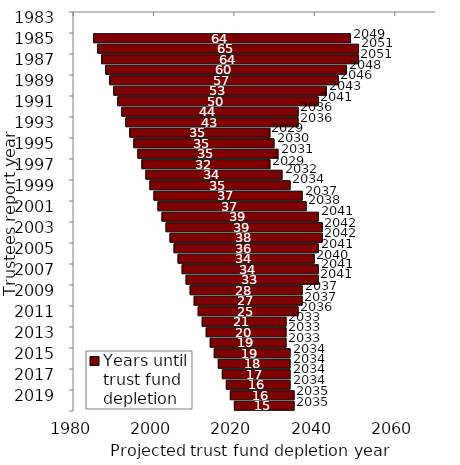
| Category | Series 1 | Years until trust fund depletion |
|---|---|---|
| 1983.0 | 1983 | 0 |
| 1984.0 | 1984 | 0 |
| 1985.0 | 1985 | 64 |
| 1986.0 | 1986 | 65 |
| 1987.0 | 1987 | 64 |
| 1988.0 | 1988 | 60 |
| 1989.0 | 1989 | 57 |
| 1990.0 | 1990 | 53 |
| 1991.0 | 1991 | 50 |
| 1992.0 | 1992 | 44 |
| 1993.0 | 1993 | 43 |
| 1994.0 | 1994 | 35 |
| 1995.0 | 1995 | 35 |
| 1996.0 | 1996 | 35 |
| 1997.0 | 1997 | 32 |
| 1998.0 | 1998 | 34 |
| 1999.0 | 1999 | 35 |
| 2000.0 | 2000 | 37 |
| 2001.0 | 2001 | 37 |
| 2002.0 | 2002 | 39 |
| 2003.0 | 2003 | 39 |
| 2004.0 | 2004 | 38 |
| 2005.0 | 2005 | 36 |
| 2006.0 | 2006 | 34 |
| 2007.0 | 2007 | 34 |
| 2008.0 | 2008 | 33 |
| 2009.0 | 2009 | 28 |
| 2010.0 | 2010 | 27 |
| 2011.0 | 2011 | 25 |
| 2012.0 | 2012 | 21 |
| 2013.0 | 2013 | 20 |
| 2014.0 | 2014 | 19 |
| 2015.0 | 2015 | 19 |
| 2016.0 | 2016 | 18 |
| 2017.0 | 2017 | 17 |
| 2018.0 | 2018 | 16 |
| 2019.0 | 2019 | 16 |
| 2020.0 | 2020 | 15 |